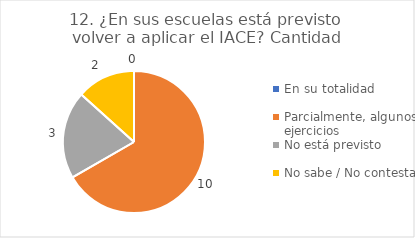
| Category | 12. ¿En sus escuelas está previsto volver a aplicar el IACE? |
|---|---|
| En su totalidad  | 0 |
| Parcialmente, algunos ejercicios  | 0.667 |
| No está previsto  | 0.2 |
| No sabe / No contesta | 0.133 |